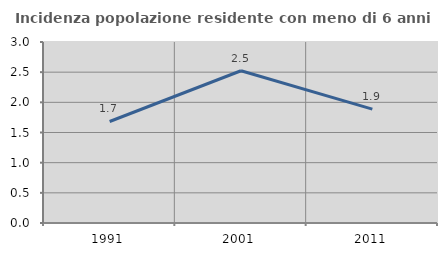
| Category | Incidenza popolazione residente con meno di 6 anni |
|---|---|
| 1991.0 | 1.683 |
| 2001.0 | 2.524 |
| 2011.0 | 1.887 |